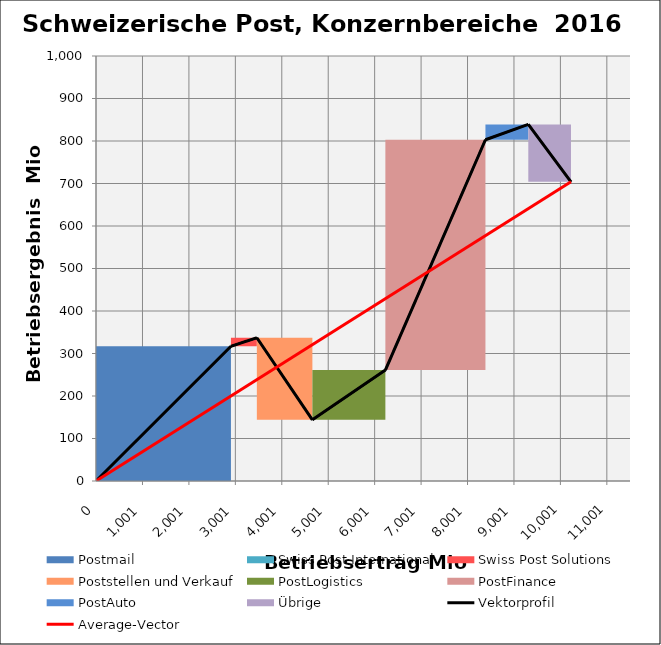
| Category | transparent | Postmail | Swiss Post International | Swiss Post Solutions | Poststellen und Verkauf | PostLogistics | PostFinance | PostAuto | Übrige | Border right & top |
|---|---|---|---|---|---|---|---|---|---|---|
| 0.0 | 0 | 317 | 0 | 0 | 0 | 0 | 0 | 0 | 0 | 0 |
| 2906.0 | 0 | 317 | 0 | 0 | 0 | 0 | 0 | 0 | 0 | 0 |
| 2906.0 | 317 | 0 | 0 | 0 | 0 | 0 | 0 | 0 | 0 | 0 |
| 2906.0 | 317 | 0 | 0 | 0 | 0 | 0 | 0 | 0 | 0 | 0 |
| 2906.0 | 317 | 0 | 0 | 20 | 0 | 0 | 0 | 0 | 0 | 0 |
| 3464.0 | 317 | 0 | 0 | 20 | 0 | 0 | 0 | 0 | 0 | 0 |
| 3464.0 | 337 | 0 | 0 | 0 | -193 | 0 | 0 | 0 | 0 | 0 |
| 4660.0 | 337 | 0 | 0 | 0 | -193 | 0 | 0 | 0 | 0 | 0 |
| 4660.0 | 144 | 0 | 0 | 0 | 0 | 117 | 0 | 0 | 0 | 0 |
| 6232.0 | 144 | 0 | 0 | 0 | 0 | 117 | 0 | 0 | 0 | 0 |
| 6232.0 | 261 | 0 | 0 | 0 | 0 | 0 | 542 | 0 | 0 | 0 |
| 8387.0 | 261 | 0 | 0 | 0 | 0 | 0 | 542 | 0 | 0 | 0 |
| 8387.0 | 803 | 0 | 0 | 0 | 0 | 0 | 0 | 36 | 0 | 0 |
| 9310.0 | 803 | 0 | 0 | 0 | 0 | 0 | 0 | 36 | 0 | 0 |
| 9310.0 | 839 | 0 | 0 | 0 | 0 | 0 | 0 | 0 | -135 | 0 |
| 10229.0 | 839 | 0 | 0 | 0 | 0 | 0 | 0 | 0 | -135 | 0 |
| 10229.0 | 704 | 0 | 0 | 0 | 0 | 0 | 0 | 0 | 0 | 0 |
| 10229.0 | 704 | 0 | 0 | 0 | 0 | 0 | 0 | 0 | 0 | 0 |
| 10229.0 | 704 | 0 | 0 | 0 | 0 | 0 | 0 | 0 | 0 | 0 |
| 10229.0 | 704 | 0 | 0 | 0 | 0 | 0 | 0 | 0 | 0 | 0 |
| 10229.0 | 704 | 0 | 0 | 0 | 0 | 0 | 0 | 0 | 0 | 200 |
| 11500.0 | 704 | 0 | 0 | 0 | 0 | 0 | 0 | 0 | 0 | 200 |
| 11500.0 | 704 | 0 | 0 | 0 | 0 | 0 | 0 | 0 | 0 | 200 |